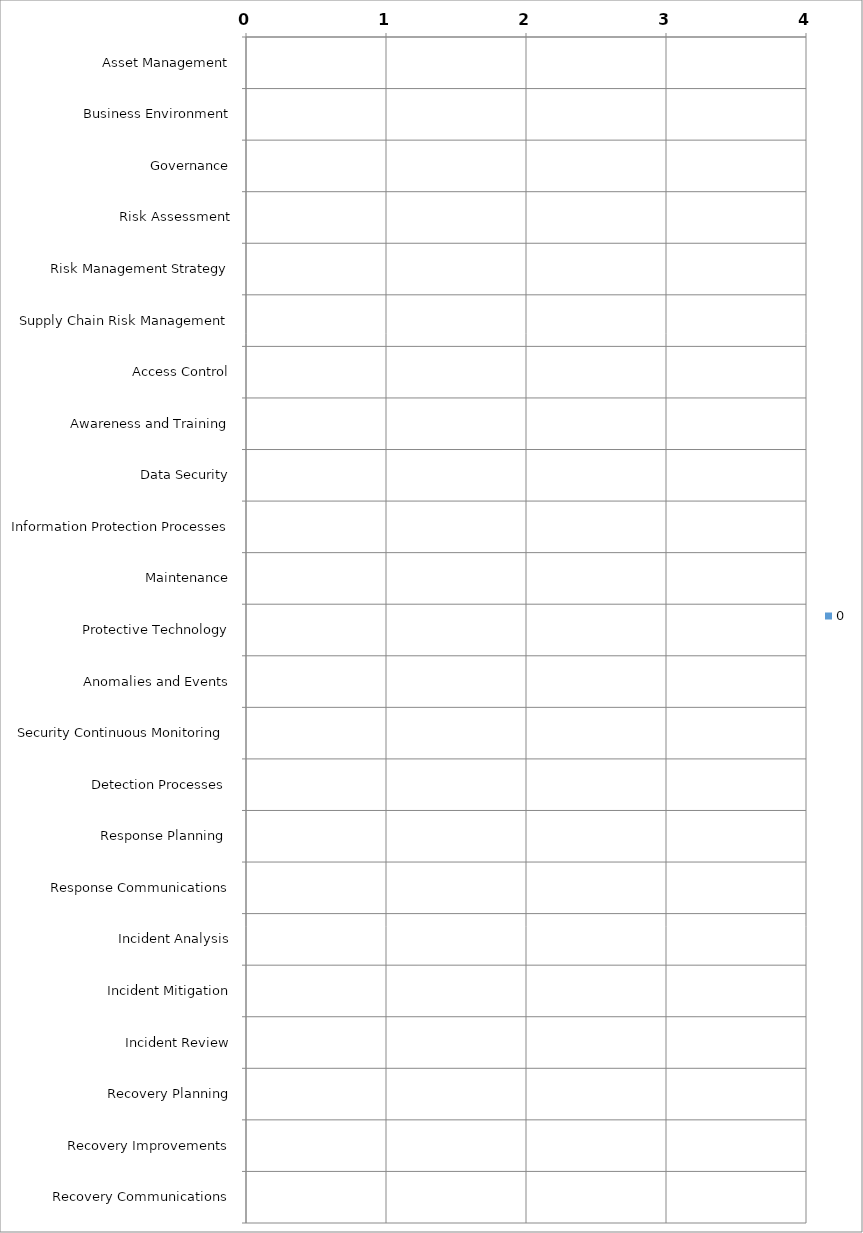
| Category | 0 |
|---|---|
| Asset Management | 0 |
| Business Environment | 0 |
| Governance | 0 |
| Risk Assessment | 0 |
| Risk Management Strategy | 0 |
| Supply Chain Risk Management | 0 |
| Access Control | 0 |
| Awareness and Training | 0 |
| Data Security | 0 |
| Information Protection Processes | 0 |
| Maintenance | 0 |
| Protective Technology | 0 |
| Anomalies and Events | 0 |
| Security Continuous Monitoring  | 0 |
| Detection Processes  | 0 |
| Response Planning  | 0 |
| Response Communications | 0 |
| Incident Analysis | 0 |
| Incident Mitigation | 0 |
| Incident Review | 0 |
| Recovery Planning | 0 |
| Recovery Improvements | 0 |
| Recovery Communications | 0 |